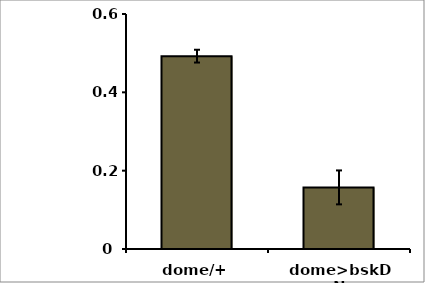
| Category | Series 0 |
|---|---|
| dome/+ | 0.492 |
| dome>bskDN | 0.157 |